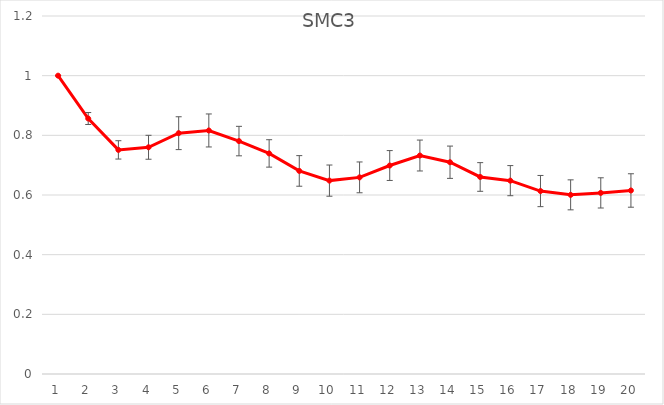
| Category | SMC3 |
|---|---|
| 0 | 1 |
| 1 | 0.856 |
| 2 | 0.751 |
| 3 | 0.76 |
| 4 | 0.807 |
| 5 | 0.816 |
| 6 | 0.781 |
| 7 | 0.739 |
| 8 | 0.681 |
| 9 | 0.648 |
| 10 | 0.659 |
| 11 | 0.699 |
| 12 | 0.732 |
| 13 | 0.71 |
| 14 | 0.66 |
| 15 | 0.648 |
| 16 | 0.613 |
| 17 | 0.601 |
| 18 | 0.607 |
| 19 | 0.615 |